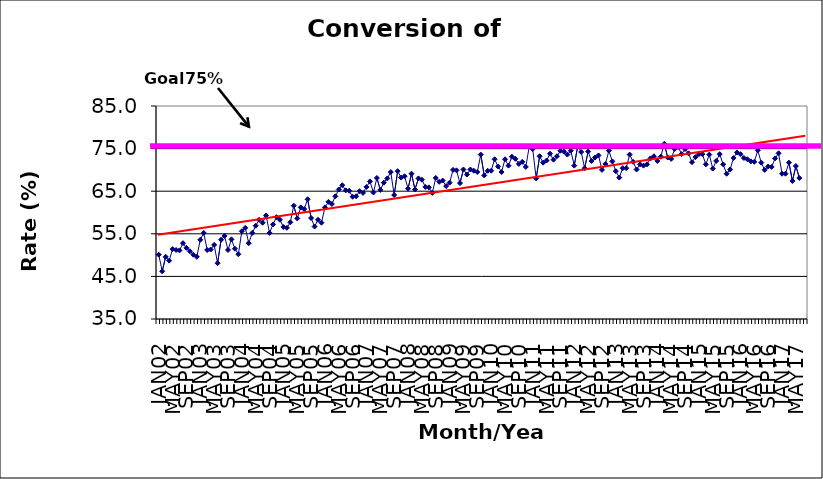
| Category | Series 0 |
|---|---|
| JAN02 | 50.1 |
| FEB02 | 46.2 |
| MAR02 | 49.6 |
| APR02 | 48.7 |
| MAY02 | 51.4 |
| JUN02 | 51.2 |
| JUL02 | 51.1 |
| AUG02 | 52.8 |
| SEP02 | 51.7 |
| OCT02 | 50.9 |
| NOV02 | 50.1 |
| DEC02 | 49.6 |
| JAN03 | 53.6 |
| FEB03 | 55.2 |
| MAR03 | 51.2 |
| APR03 | 51.3 |
| MAY03 | 52.4 |
| JUN03 | 48.1 |
| JUL03 | 53.6 |
| AUG03 | 54.5 |
| SEP03 | 51.2 |
| OCT03 | 53.7 |
| NOV03 | 51.5 |
| DEC03 | 50.2 |
| JAN04 | 55.6 |
| FEB04 | 56.4 |
| MAR04 | 52.8 |
| APR04 | 55.2 |
| MAY04 | 56.9 |
| JUN04 | 58.3 |
| JUL04 | 57.6 |
| AUG04 | 59.3 |
| SEP04 | 55.2 |
| OCT04 | 57.2 |
| NOV04 | 58.9 |
| DEC04 | 58.3 |
| JAN05 | 56.6 |
| FEB05 | 56.4 |
| MAR05 | 57.7 |
| APR05 | 61.6 |
| MAY05 | 58.6 |
| JUN05 | 61.2 |
| JUL05 | 60.8 |
| AUG05 | 63.1 |
| SEP05 | 58.7 |
| OCT05 | 56.7 |
| NOV05 | 58.3 |
| DEC05 | 57.6 |
| JAN06 | 61.2 |
| FEB06 | 62.5 |
| MAR06 | 62 |
| APR06 | 63.8 |
| MAY06 | 65.4 |
| JUN06 | 66.4 |
| JUL06 | 65.2 |
| AUG06 | 65.1 |
| SEP06 | 63.7 |
| OCT06 | 63.8 |
| NOV06 | 65 |
| DEC06 | 64.6 |
| JAN07 | 66 |
| FEB07 | 67.3 |
| MAR07 | 64.7 |
| APR07 | 68.1 |
| MAY07 | 65.3 |
| JUN07 | 67 |
| JUL07 | 68 |
| AUG07 | 69.5 |
| SEP07 | 64.1 |
| OCT07 | 69.7 |
| NOV07 | 68.2 |
| DEC07 | 68.5 |
| JAN08 | 65.6 |
| FEB08 | 69.1 |
| MAR08 | 65.4 |
| APR08 | 68 |
| MAY08 | 67.7 |
| JUN08 | 66 |
| JUL08 | 65.9 |
| AUG08 | 64.6 |
| SEP08 | 68.1 |
| OCT08 | 67.2 |
| NOV08 | 67.5 |
| DEC08 | 66.2 |
| JAN09 | 67 |
| FEB09 | 70 |
| MAR09 | 69.9 |
| APR09 | 66.9 |
| MAY09 | 70.1 |
| JUN09 | 68.9 |
| JUL09 | 70.1 |
| AUG09 | 69.8 |
| SEP09 | 69.5 |
| OCT09 | 73.6 |
| NOV09 | 68.7 |
| DEC09 | 69.8 |
| JAN10 | 69.8 |
| FEB10 | 72.5 |
| MAR10 | 70.8 |
| APR10 | 69.5 |
| MAY10 | 72.5 |
| JUN10 | 71 |
| JUL10 | 73.1 |
| AUG10 | 72.6 |
| SEP10 | 71.4 |
| OCT10 | 71.9 |
| NOV10 | 70.7 |
| DEC10 | 75.5 |
| JAN11 | 74.9 |
| FEB11 | 68 |
| MAR11 | 73.2 |
| APR11 | 71.7 |
| MAY11 | 72.2 |
| JUN11 | 73.8 |
| JUL11 | 72.4 |
| AUG11 | 73.2 |
| SEP11 | 74.5 |
| OCT11 | 74.3 |
| NOV11 | 73.6 |
| DEC11 | 74.5 |
| JAN12 | 71 |
| FEB12 | 75.6 |
| MAR12 | 74.2 |
| APR12 | 70.4 |
| MAY12 | 74.3 |
| JUN12 | 72.1 |
| JUL12 | 72.9 |
| AUG12 | 73.4 |
| SEP12 | 70 |
| OCT12 | 71.4 |
| NOV12 | 74.5 |
| DEC12 | 72 |
| JAN13 | 69.7 |
| FEB13 | 68.2 |
| MAR13 | 70.4 |
| APR13 | 70.4 |
| MAY13 | 73.6 |
| JUN13 | 71.9 |
| JUL13 | 70.1 |
| AUG13 | 71.3 |
| SEP13 | 71 |
| OCT13 | 71.3 |
| NOV13 | 72.7 |
| DEC13 | 73.2 |
| JAN14 | 72.1 |
| FEB14 | 73.1 |
| MAR14 | 76.1 |
| APR14 | 72.9 |
| MAY14 | 72.6 |
| JUN14 | 74.9 |
| JUL14 | 75.4 |
| AUG14 | 73.7 |
| SEP14 | 74.9 |
| OCT14 | 73.9 |
| NOV14 | 71.8 |
| DEC14 | 73 |
| JAN15 | 73.7 |
| FEB15 | 73.7 |
| MAR15 | 71.3 |
| APR15 | 73.6 |
| MAY15 | 70.3 |
| JUN15 | 72.1 |
| JUL15 | 73.7 |
| AUG15 | 71.3 |
| SEP15 | 69.1 |
| OCT15 | 70.1 |
| NOV15 | 72.8 |
| DEC15 | 74.1 |
| JAN16 | 73.7 |
| FEB16 | 72.8 |
| MAR16 | 72.5 |
| APR16 | 72 |
| MAY16 | 71.9 |
| JUN16 | 74.6 |
| JUL16 | 71.7 |
| AUG16 | 70 |
| SEP16 | 70.8 |
| OCT16 | 70.7 |
| NOV16 | 72.7 |
| DEC16 | 73.9 |
| JAN17 | 69.1 |
| FEB17 | 69.1 |
| MAR17 | 71.7 |
| APR17 | 67.4 |
| MAY17 | 70.9 |
| JUN17 | 68.1 |